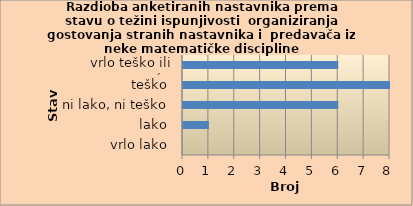
| Category | Series 0 |
|---|---|
| vrlo lako | 0 |
| lako | 1 |
| ni lako, ni teško | 6 |
| teško | 8 |
| vrlo teško ili nemoguće | 6 |